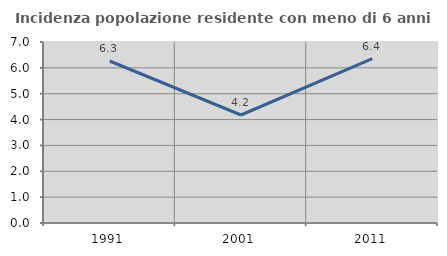
| Category | Incidenza popolazione residente con meno di 6 anni |
|---|---|
| 1991.0 | 6.266 |
| 2001.0 | 4.177 |
| 2011.0 | 6.357 |